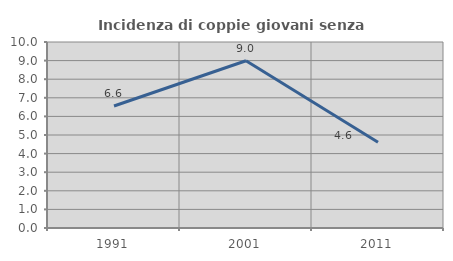
| Category | Incidenza di coppie giovani senza figli |
|---|---|
| 1991.0 | 6.557 |
| 2001.0 | 8.991 |
| 2011.0 | 4.61 |